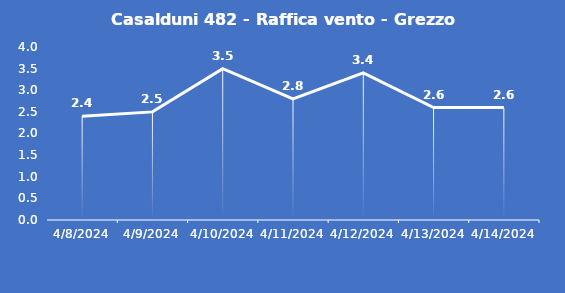
| Category | Casalduni 482 - Raffica vento - Grezzo (m/s) |
|---|---|
| 4/8/24 | 2.4 |
| 4/9/24 | 2.5 |
| 4/10/24 | 3.5 |
| 4/11/24 | 2.8 |
| 4/12/24 | 3.4 |
| 4/13/24 | 2.6 |
| 4/14/24 | 2.6 |